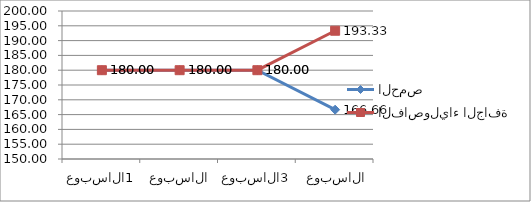
| Category | الحمص | الفاصولياء الجافة |
|---|---|---|
| الاسبوع 1  | 180 | 180 |
| الاسبوع 2 | 180 | 180 |
| الاسبوع 3   | 180 | 180 |
| الاسبوع  4 | 166.66 | 193.33 |